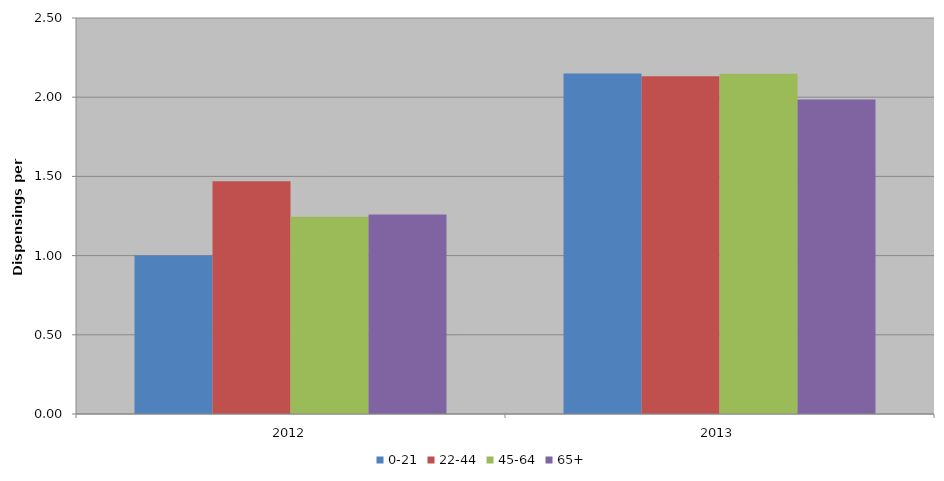
| Category | 0-21 | 22-44 | 45-64 | 65+ |
|---|---|---|---|---|
| 2012 | 1 | 1.47 | 1.245 | 1.26 |
| 2013 | 2.15 | 2.133 | 2.148 | 1.985 |